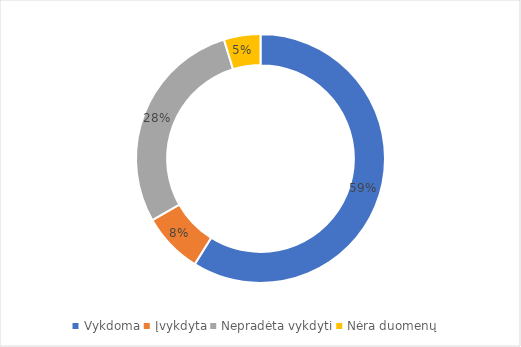
| Category | Proc. nuo visų |
|---|---|
| Vykdoma | 0.589 |
| Įvykdyta | 0.079 |
| Nepradėta vykdyti | 0.285 |
| Nėra duomenų | 0.047 |